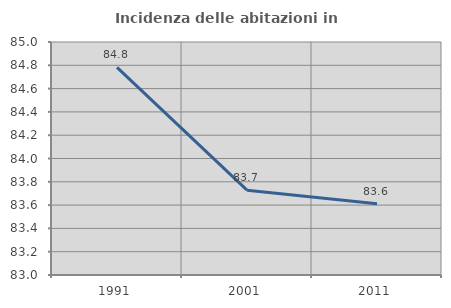
| Category | Incidenza delle abitazioni in proprietà  |
|---|---|
| 1991.0 | 84.783 |
| 2001.0 | 83.728 |
| 2011.0 | 83.612 |